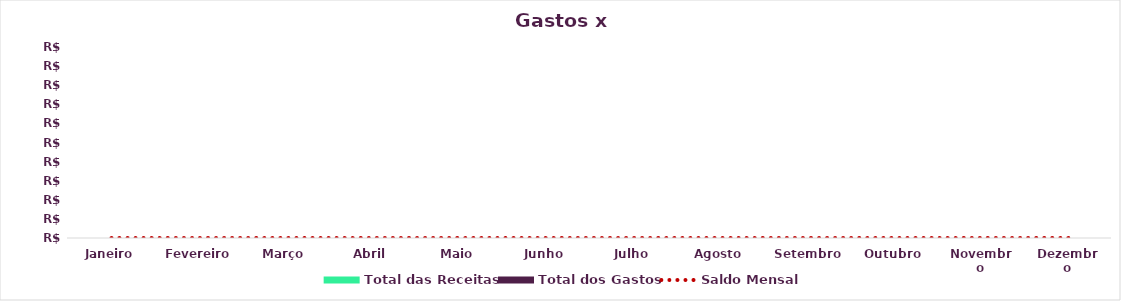
| Category | Total das Receitas | Total dos Gastos |
|---|---|---|
| Janeiro | 0 | 0 |
| Fevereiro | 0 | 0 |
| Março | 0 | 0 |
| Abril | 0 | 0 |
| Maio | 0 | 0 |
| Junho | 0 | 0 |
| Julho | 0 | 0 |
| Agosto | 0 | 0 |
| Setembro | 0 | 0 |
| Outubro | 0 | 0 |
| Novembro | 0 | 0 |
| Dezembro | 0 | 0 |